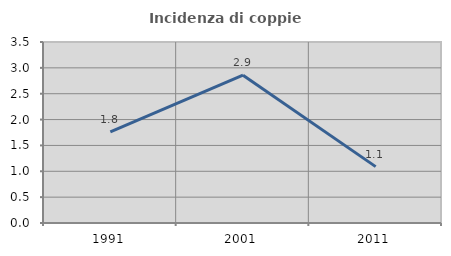
| Category | Incidenza di coppie miste |
|---|---|
| 1991.0 | 1.762 |
| 2001.0 | 2.857 |
| 2011.0 | 1.09 |